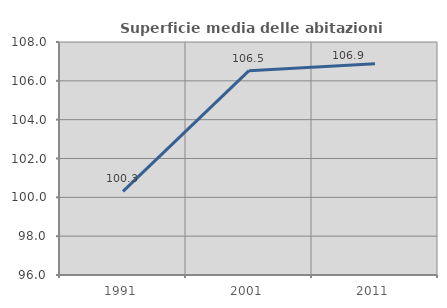
| Category | Superficie media delle abitazioni occupate |
|---|---|
| 1991.0 | 100.31 |
| 2001.0 | 106.522 |
| 2011.0 | 106.885 |